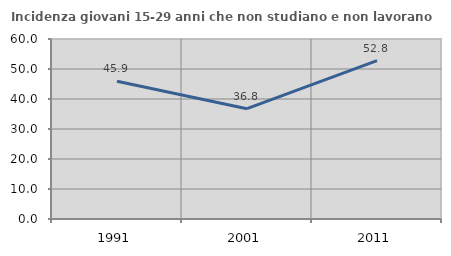
| Category | Incidenza giovani 15-29 anni che non studiano e non lavorano  |
|---|---|
| 1991.0 | 45.93 |
| 2001.0 | 36.765 |
| 2011.0 | 52.778 |